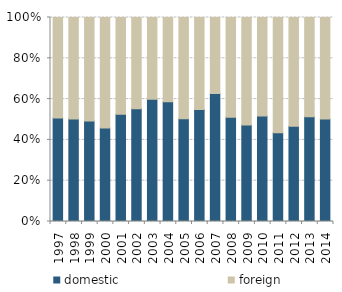
| Category | domestic | foreign |
|---|---|---|
| 1997.0 | 1569 | 1522 |
| 1998.0 | 1778 | 1764 |
| 1999.0 | 1912 | 1968 |
| 2000.0 | 1905 | 2255 |
| 2001.0 | 2019 | 1823 |
| 2002.0 | 1986 | 1609 |
| 2003.0 | 2637 | 1763 |
| 2004.0 | 2516 | 1771 |
| 2005.0 | 2547 | 2513 |
| 2006.0 | 2916 | 2394 |
| 2007.0 | 3518 | 2090 |
| 2008.0 | 3267 | 3130 |
| 2009.0 | 2007 | 2233 |
| 2010.0 | 2034 | 1895 |
| 2011.0 | 1977 | 2570 |
| 2012.0 | 1685 | 1924 |
| 2013.0 | 2083 | 1977 |
| 2014.0 | 2123 | 2107 |